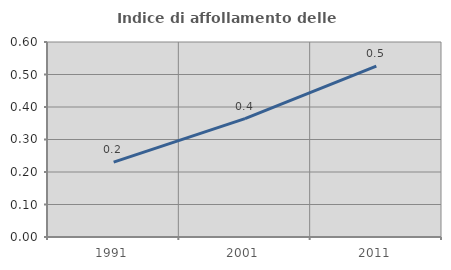
| Category | Indice di affollamento delle abitazioni  |
|---|---|
| 1991.0 | 0.23 |
| 2001.0 | 0.364 |
| 2011.0 | 0.526 |